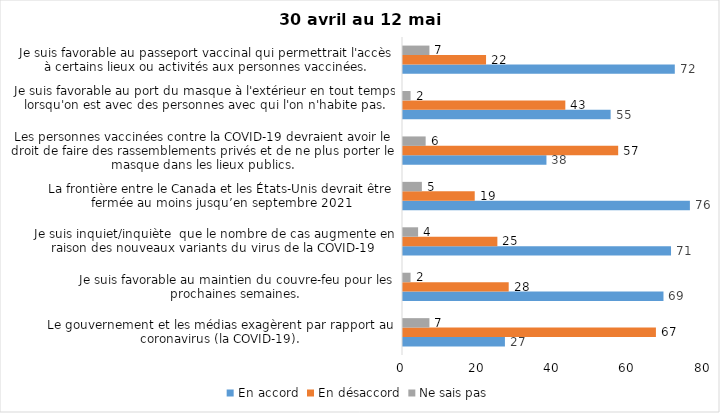
| Category | En accord | En désaccord | Ne sais pas |
|---|---|---|---|
| Le gouvernement et les médias exagèrent par rapport au coronavirus (la COVID-19). | 27 | 67 | 7 |
| Je suis favorable au maintien du couvre-feu pour les prochaines semaines. | 69 | 28 | 2 |
| Je suis inquiet/inquiète  que le nombre de cas augmente en raison des nouveaux variants du virus de la COVID-19 | 71 | 25 | 4 |
| La frontière entre le Canada et les États-Unis devrait être fermée au moins jusqu’en septembre 2021 | 76 | 19 | 5 |
| Les personnes vaccinées contre la COVID-19 devraient avoir le droit de faire des rassemblements privés et de ne plus porter le masque dans les lieux publics. | 38 | 57 | 6 |
| Je suis favorable au port du masque à l'extérieur en tout temps lorsqu'on est avec des personnes avec qui l'on n'habite pas. | 55 | 43 | 2 |
| Je suis favorable au passeport vaccinal qui permettrait l'accès à certains lieux ou activités aux personnes vaccinées. | 72 | 22 | 7 |